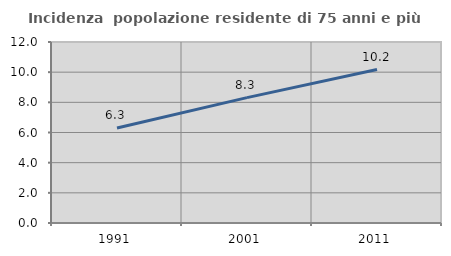
| Category | Incidenza  popolazione residente di 75 anni e più |
|---|---|
| 1991.0 | 6.299 |
| 2001.0 | 8.314 |
| 2011.0 | 10.171 |